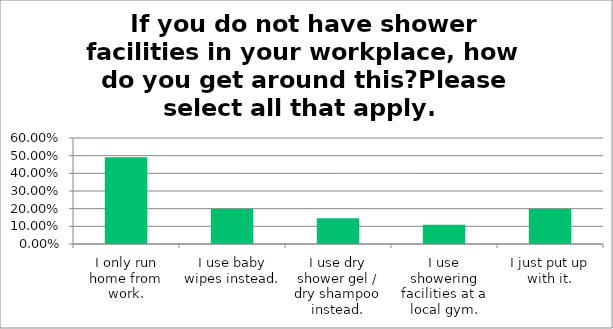
| Category | Responses |
|---|---|
| I only run home from work. | 0.491 |
| I use baby wipes instead. | 0.2 |
| I use dry shower gel / dry shampoo instead. | 0.146 |
| I use showering facilities at a local gym. | 0.109 |
| I just put up with it. | 0.2 |